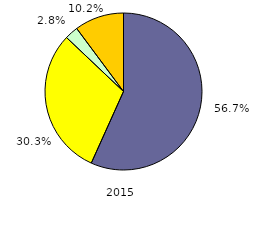
| Category | 2015 |
|---|---|
| 0 | 56.729 |
| 1 | 30.339 |
| 2 | 2.763 |
| 3 | 10.169 |